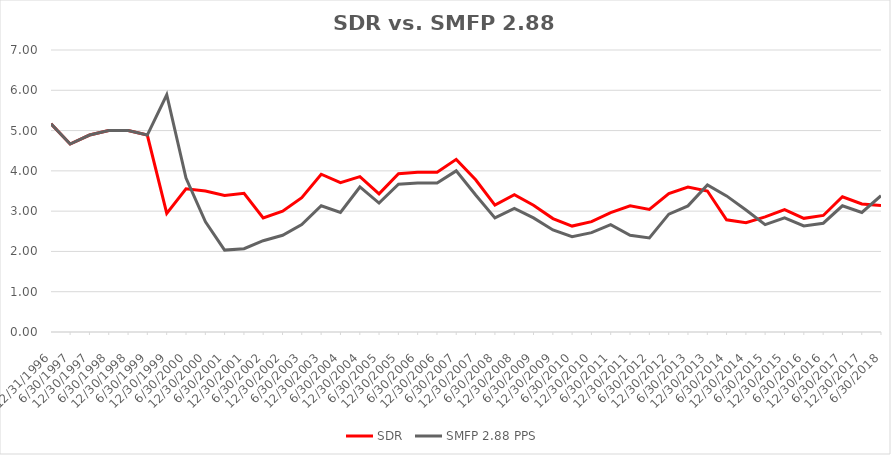
| Category | SDR | SMFP 2.88 PPS |
|---|---|---|
| 12/31/96 | 5.167 | 5.167 |
| 6/30/97 | 4.667 | 4.667 |
| 12/31/97 | 4.889 | 4.889 |
| 6/30/98 | 5 | 5 |
| 12/31/98 | 5 | 5 |
| 6/30/99 | 4.889 | 4.889 |
| 12/31/99 | 2.944 | 5.889 |
| 6/30/00 | 3.556 | 3.823 |
| 12/31/00 | 3.5 | 2.737 |
| 6/30/01 | 3.389 | 2.033 |
| 12/31/01 | 3.444 | 2.067 |
| 6/30/02 | 2.833 | 2.267 |
| 12/31/02 | 3 | 2.4 |
| 6/30/03 | 3.333 | 2.667 |
| 12/31/03 | 3.917 | 3.133 |
| 6/30/04 | 3.708 | 2.967 |
| 12/31/04 | 3.857 | 3.6 |
| 6/30/05 | 3.429 | 3.2 |
| 12/31/05 | 3.929 | 3.667 |
| 6/30/06 | 3.964 | 3.7 |
| 12/31/06 | 3.964 | 3.7 |
| 6/30/07 | 4.286 | 4 |
| 12/31/07 | 3.778 | 3.4 |
| 6/30/08 | 3.148 | 2.833 |
| 12/31/08 | 3.407 | 3.067 |
| 6/30/09 | 3.148 | 2.833 |
| 12/31/09 | 2.815 | 2.533 |
| 6/30/10 | 2.63 | 2.367 |
| 12/31/10 | 2.741 | 2.467 |
| 6/30/11 | 2.963 | 2.667 |
| 12/31/11 | 3.13 | 2.4 |
| 6/30/12 | 3.043 | 2.333 |
| 12/31/12 | 3.435 | 2.926 |
| 6/30/13 | 3.6 | 3.13 |
| 12/31/13 | 3.5 | 3.652 |
| 6/30/14 | 2.786 | 3.378 |
| 12/31/14 | 2.714 | 3.029 |
| 6/30/15 | 2.857 | 2.667 |
| 12/31/15 | 3.036 | 2.833 |
| 6/30/16 | 2.821 | 2.633 |
| 12/31/16 | 2.893 | 2.7 |
| 6/30/17 | 3.357 | 3.133 |
| 12/31/17 | 3.179 | 2.967 |
| 6/30/18 | 3.143 | 3.385 |